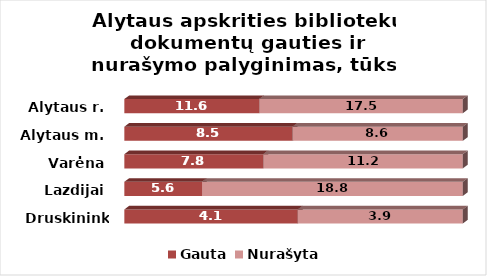
| Category | Gauta | Nurašyta |
|---|---|---|
| Druskininkai | 4.1 | 3.9 |
| Lazdijai | 5.6 | 18.8 |
| Varėna | 7.8 | 11.2 |
| Alytaus m. | 8.5 | 8.6 |
| Alytaus r. | 11.6 | 17.5 |